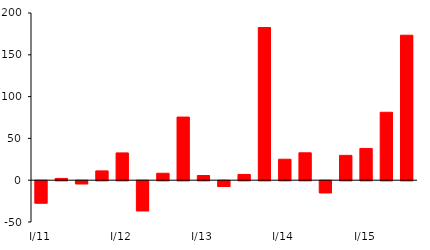
| Category | Series 1 |
|---|---|
| I/11 | -26.789 |
| II | 2.123 |
| III | -3.698 |
| IV | 11.134 |
| I/12 | 32.632 |
| II | -35.982 |
| III | 8.321 |
| IV | 75.502 |
| I/13 | 5.61 |
| II | -6.912 |
| III | 6.889 |
| IV | 182.604 |
| I/14 | 25.08 |
| II | 32.776 |
| III | -14.448 |
| IV | 29.714 |
| I/15 | 38.01 |
| II | 81.243 |
| III | 173.44 |